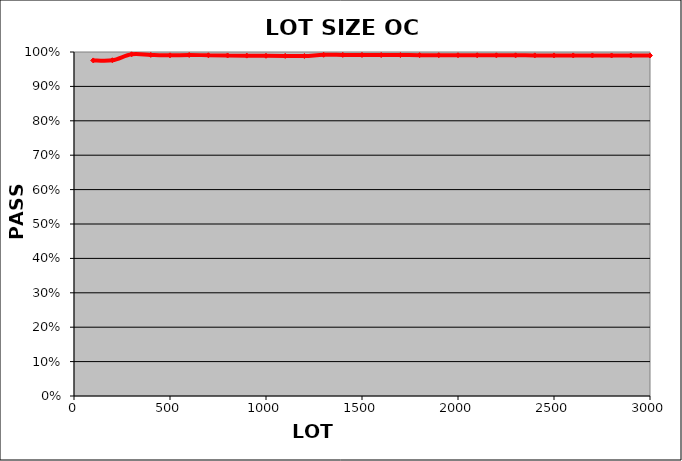
| Category | PASS
RATE |
|---|---|
| 100.0 | 0.976 |
| 200.0 | 0.976 |
| 300.0 | 0.993 |
| 400.0 | 0.992 |
| 500.0 | 0.99 |
| 600.0 | 0.991 |
| 700.0 | 0.991 |
| 800.0 | 0.99 |
| 900.0 | 0.989 |
| 1000.0 | 0.989 |
| 1100.0 | 0.989 |
| 1200.0 | 0.988 |
| 1300.0 | 0.992 |
| 1400.0 | 0.992 |
| 1500.0 | 0.991 |
| 1600.0 | 0.991 |
| 1700.0 | 0.991 |
| 1800.0 | 0.991 |
| 1900.0 | 0.991 |
| 2000.0 | 0.991 |
| 2100.0 | 0.99 |
| 2200.0 | 0.99 |
| 2300.0 | 0.99 |
| 2400.0 | 0.99 |
| 2500.0 | 0.99 |
| 2600.0 | 0.99 |
| 2700.0 | 0.99 |
| 2800.0 | 0.99 |
| 2900.0 | 0.99 |
| 3000.0 | 0.99 |